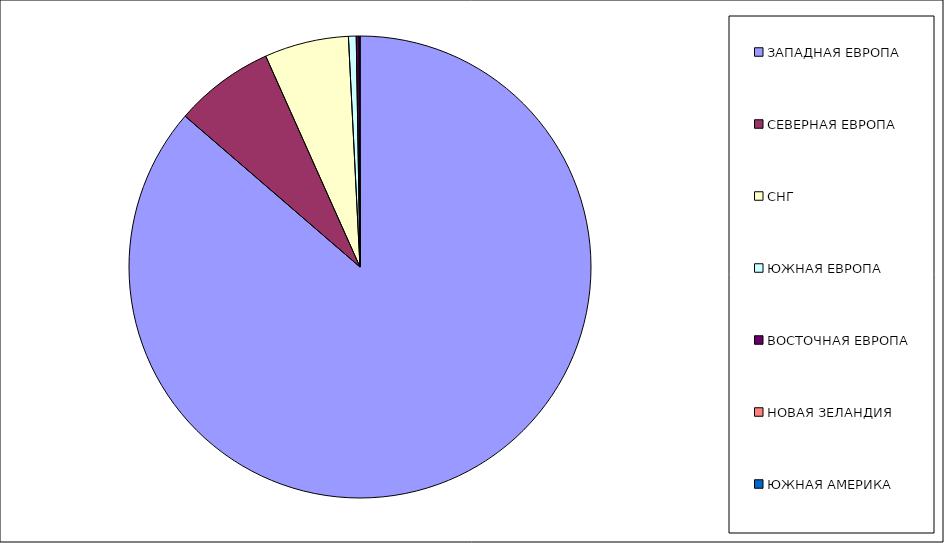
| Category | Оборот |
|---|---|
| ЗАПАДНАЯ ЕВРОПА | 0.863 |
| СЕВЕРНАЯ ЕВРОПА | 0.07 |
| СНГ | 0.059 |
| ЮЖНАЯ ЕВРОПА | 0.005 |
| ВОСТОЧНАЯ ЕВРОПА | 0.002 |
| НОВАЯ ЗЕЛАНДИЯ | 0 |
| ЮЖНАЯ АМЕРИКА | 0 |